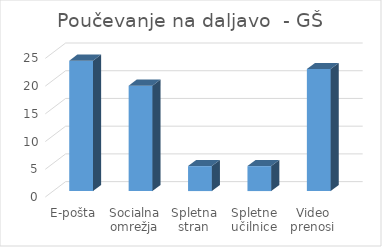
| Category | Series 0 |
|---|---|
| E-pošta | 23.5 |
| Socialna omrežja | 19 |
| Spletna stran | 4.5 |
| Spletne učilnice | 4.5 |
| Video prenosi | 22 |